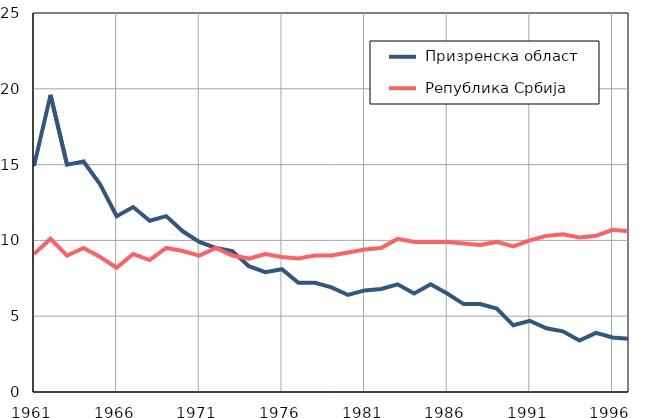
| Category |  Призренска област |  Република Србија |
|---|---|---|
| 1961.0 | 14.9 | 9.1 |
| 1962.0 | 19.6 | 10.1 |
| 1963.0 | 15 | 9 |
| 1964.0 | 15.2 | 9.5 |
| 1965.0 | 13.7 | 8.9 |
| 1966.0 | 11.6 | 8.2 |
| 1967.0 | 12.2 | 9.1 |
| 1968.0 | 11.3 | 8.7 |
| 1969.0 | 11.6 | 9.5 |
| 1970.0 | 10.6 | 9.3 |
| 1971.0 | 9.9 | 9 |
| 1972.0 | 9.5 | 9.5 |
| 1973.0 | 9.3 | 9 |
| 1974.0 | 8.3 | 8.8 |
| 1975.0 | 7.9 | 9.1 |
| 1976.0 | 8.1 | 8.9 |
| 1977.0 | 7.2 | 8.8 |
| 1978.0 | 7.2 | 9 |
| 1979.0 | 6.9 | 9 |
| 1980.0 | 6.4 | 9.2 |
| 1981.0 | 6.7 | 9.4 |
| 1982.0 | 6.8 | 9.5 |
| 1983.0 | 7.1 | 10.1 |
| 1984.0 | 6.5 | 9.9 |
| 1985.0 | 7.1 | 9.9 |
| 1986.0 | 6.5 | 9.9 |
| 1987.0 | 5.8 | 9.8 |
| 1988.0 | 5.8 | 9.7 |
| 1989.0 | 5.5 | 9.9 |
| 1990.0 | 4.4 | 9.6 |
| 1991.0 | 4.7 | 10 |
| 1992.0 | 4.2 | 10.3 |
| 1993.0 | 4 | 10.4 |
| 1994.0 | 3.4 | 10.2 |
| 1995.0 | 3.9 | 10.3 |
| 1996.0 | 3.6 | 10.7 |
| 1997.0 | 3.5 | 10.6 |